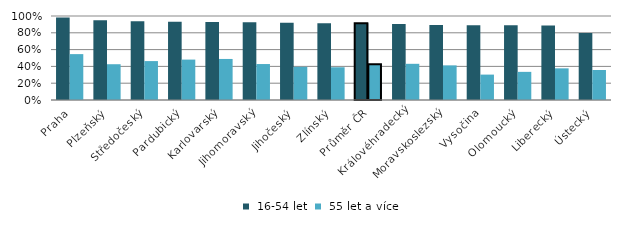
| Category |  16-54 let |  55 let a více |
|---|---|---|
|   Praha | 0.981 | 0.546 |
|   Plzeňský | 0.949 | 0.426 |
|   Středočeský | 0.938 | 0.463 |
|   Pardubický | 0.931 | 0.481 |
|   Karlovarský | 0.928 | 0.489 |
|   Jihomoravský | 0.925 | 0.428 |
|   Jihočeský | 0.92 | 0.395 |
|   Zlínský | 0.915 | 0.39 |
| Průměr ČR | 0.914 | 0.426 |
|   Královéhradecký | 0.904 | 0.431 |
|   Moravskoslezský | 0.892 | 0.412 |
|   Vysočina | 0.891 | 0.302 |
|   Olomoucký | 0.89 | 0.335 |
|   Liberecký | 0.886 | 0.377 |
|   Ústecký | 0.798 | 0.357 |